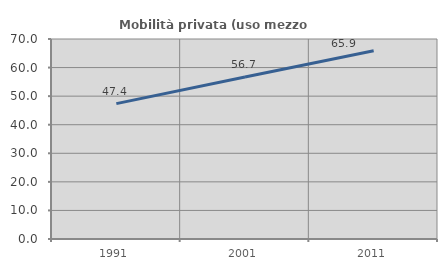
| Category | Mobilità privata (uso mezzo privato) |
|---|---|
| 1991.0 | 47.387 |
| 2001.0 | 56.716 |
| 2011.0 | 65.916 |